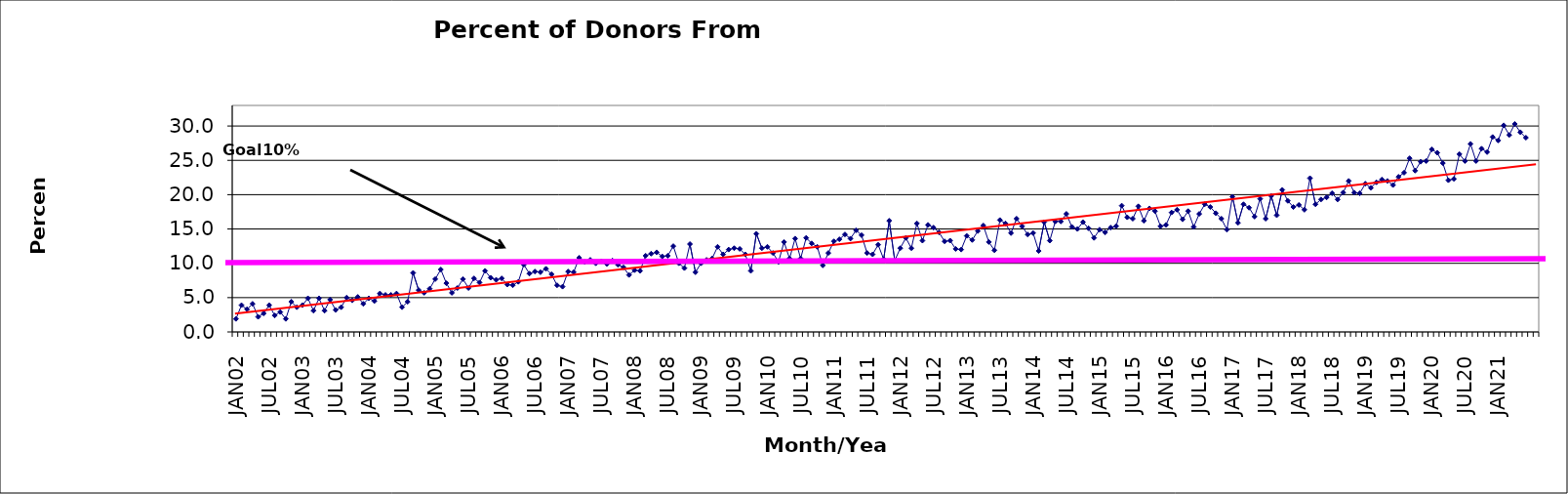
| Category | Series 0 |
|---|---|
| JAN02 | 1.9 |
| FEB02 | 3.9 |
| MAR02 | 3.3 |
| APR02 | 4.1 |
| MAY02 | 2.2 |
| JUN02 | 2.7 |
| JUL02 | 3.9 |
| AUG02 | 2.4 |
| SEP02 | 2.9 |
| OCT02 | 1.9 |
| NOV02 | 4.4 |
| DEC02 | 3.6 |
| JAN03 | 3.9 |
| FEB03 | 4.9 |
| MAR03 | 3.1 |
| APR03 | 4.9 |
| MAY03 | 3.1 |
| JUN03 | 4.7 |
| JUL03 | 3.2 |
| AUG03 | 3.6 |
| SEP03 | 5 |
| OCT03 | 4.6 |
| NOV03 | 5.1 |
| DEC03 | 4.1 |
| JAN04 | 4.9 |
| FEB04 | 4.5 |
| MAR04 | 5.6 |
| APR04 | 5.4 |
| MAY04 | 5.4 |
| JUN04 | 5.6 |
| JUL04 | 3.6 |
| AUG04 | 4.4 |
| SEP04 | 8.6 |
| OCT04 | 6.1 |
| NOV04 | 5.7 |
| DEC04 | 6.3 |
| JAN05 | 7.7 |
| FEB05 | 9.1 |
| MAR05 | 7.1 |
| APR05 | 5.7 |
| MAY05 | 6.4 |
| JUN05 | 7.7 |
| JUL05 | 6.4 |
| AUG05 | 7.8 |
| SEP05 | 7.2 |
| OCT05 | 8.9 |
| NOV05 | 7.9 |
| DEC05 | 7.6 |
| JAN06 | 7.8 |
| FEB06 | 6.9 |
| MAR06 | 6.8 |
| APR06 | 7.3 |
| MAY06 | 9.8 |
| JUN06 | 8.5 |
| JUL06 | 8.8 |
| AUG06 | 8.7 |
| SEP06 | 9.2 |
| OCT06 | 8.4 |
| NOV06 | 6.8 |
| DEC06 | 6.6 |
| JAN07 | 8.8 |
| FEB07 | 8.7 |
| MAR07 | 10.8 |
| APR07 | 10.2 |
| MAY07 | 10.5 |
| JUN07 | 10 |
| JUL07 | 10.3 |
| AUG07 | 9.9 |
| SEP07 | 10.4 |
| OCT07 | 9.8 |
| NOV07 | 9.4 |
| DEC07 | 8.3 |
| JAN08 | 9 |
| FEB08 | 8.9 |
| MAR08 | 11.1 |
| APR08 | 11.4 |
| MAY08 | 11.6 |
| JUN08 | 11 |
| JUL08 | 11.1 |
| AUG08 | 12.5 |
| SEP08 | 10 |
| OCT08 | 9.3 |
| NOV08 | 12.8 |
| DEC08 | 8.7 |
| JAN09 | 10 |
| FEB09 | 10.5 |
| MAR09 | 10.7 |
| APR09 | 12.4 |
| MAY09 | 11.3 |
| JUN09 | 12 |
| JUL09 | 12.2 |
| AUG09 | 12.1 |
| SEP09 | 11.3 |
| OCT09 | 8.9 |
| NOV09 | 14.3 |
| DEC09 | 12.2 |
| JAN10 | 12.4 |
| FEB10 | 11.5 |
| MAR10 | 10.2 |
| APR10 | 13.1 |
| MAY10 | 10.7 |
| JUN10 | 13.6 |
| JUL10 | 10.7 |
| AUG10 | 13.7 |
| SEP10 | 12.9 |
| OCT10 | 12.4 |
| NOV10 | 9.7 |
| DEC10 | 11.5 |
| JAN11 | 13.2 |
| FEB11 | 13.5 |
| MAR11 | 14.2 |
| APR11 | 13.6 |
| MAY11 | 14.8 |
| JUN11 | 14.1 |
| JUL11 | 11.5 |
| AUG11 | 11.3 |
| SEP11 | 12.7 |
| OCT11 | 10.6 |
| NOV11 | 16.2 |
| DEC11 | 10.4 |
| JAN12 | 12.2 |
| FEB12 | 13.7 |
| MAR12 | 12.2 |
| APR12 | 15.8 |
| MAY12 | 13.3 |
| JUN12 | 15.6 |
| JUL12 | 15.2 |
| AUG12 | 14.5 |
| SEP12 | 13.2 |
| OCT12 | 13.3 |
| NOV12 | 12.1 |
| DEC12 | 12 |
| JAN13 | 14 |
| FEB13 | 13.4 |
| MAR13 | 14.7 |
| APR13 | 15.5 |
| MAY13 | 13.1 |
| JUN13 | 11.9 |
| JUL13 | 16.3 |
| AUG13 | 15.8 |
| SEP13 | 14.4 |
| OCT13 | 16.5 |
| NOV13 | 15.4 |
| DEC13 | 14.2 |
| JAN14 | 14.4 |
| FEB14 | 11.8 |
| MAR14 | 16 |
| APR14 | 13.3 |
| MAY14 | 16.1 |
| JUN14 | 16.1 |
| JUL14 | 17.2 |
| AUG14 | 15.3 |
| SEP14 | 15 |
| OCT14 | 16 |
| NOV14 | 15.1 |
| DEC14 | 13.7 |
| JAN15 | 14.9 |
| FEB15 | 14.5 |
| MAR15 | 15.2 |
| APR15 | 15.4 |
| MAY15 | 18.4 |
| JUN15 | 16.7 |
| JUL15 | 16.5 |
| AUG15 | 18.3 |
| SEP15 | 16.2 |
| OCT15 | 18 |
| NOV15 | 17.6 |
| DEC15 | 15.4 |
| JAN16 | 15.6 |
| FEB16 | 17.4 |
| MAR16 | 17.8 |
| APR16 | 16.4 |
| MAY16 | 17.6 |
| JUN16 | 15.3 |
| JUL16 | 17.2 |
| AUG16 | 18.6 |
| SEP16 | 18.2 |
| OCT16 | 17.3 |
| NOV16 | 16.5 |
| DEC16 | 14.9 |
| JAN17 | 19.7 |
| FEB17 | 15.9 |
| MAR17 | 18.6 |
| APR17 | 18.1 |
| MAY17 | 16.8 |
| JUN17 | 19.4 |
| JUL17 | 16.5 |
| AUG17 | 19.8 |
| SEP17 | 17 |
| OCT17 | 20.7 |
| NOV17 | 19.1 |
| DEC17 | 18.2 |
| JAN18 | 18.5 |
| FEB18 | 17.8 |
| MAR18 | 22.4 |
| APR18 | 18.6 |
| MAY18 | 19.3 |
| JUN18 | 19.6 |
| JUL18 | 20.2 |
| AUG18 | 19.3 |
| SEP18 | 20.3 |
| OCT18 | 22 |
| NOV18 | 20.3 |
| DEC18 | 20.2 |
| JAN19 | 21.6 |
| FEB19 | 21 |
| MAR19 | 21.8 |
| APR19 | 22.2 |
| MAY19 | 22 |
| JUN19 | 21.4 |
| JUL19 | 22.6 |
| AUG19 | 23.2 |
| SEP19 | 25.3 |
| OCT19 | 23.5 |
| NOV19 | 24.8 |
| DEC19 | 24.9 |
| JAN20 | 26.6 |
| FEB20 | 26.1 |
| MAR20 | 24.6 |
| APR20 | 22.1 |
| MAY20 | 22.3 |
| JUN20 | 25.9 |
| JUL20 | 24.9 |
| AUG20 | 27.4 |
| SEP20 | 24.9 |
| OCT20 | 26.7 |
| NOV20 | 26.2 |
| DEC20 | 28.4 |
| JAN21 | 27.9 |
| FEB21 | 30.1 |
| MAR21 | 28.7 |
| APR21 | 30.3 |
| MAY21 | 29.1 |
| JUN21 | 28.3 |